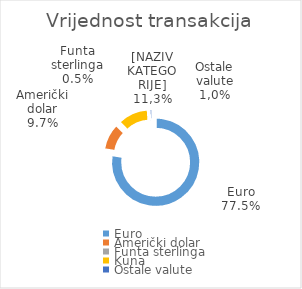
| Category | Vrijednost transakcija |
|---|---|
| Euro | 209573633929 |
| Američki dolar | 26330847020 |
| Funta sterlinga | 1285542636 |
| Kuna | 30371841332 |
| Ostale valute | 2698251200 |